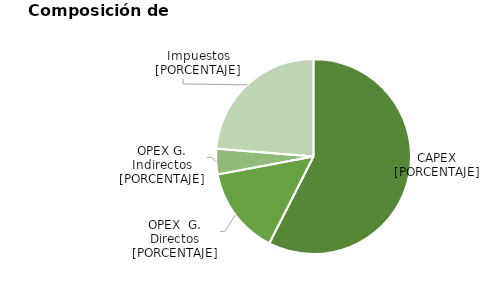
| Category | Series 0 |
|---|---|
| 0 | 30579.155 |
| 1 | 7750 |
| 2 | 2247.5 |
| 3 | 12619.545 |